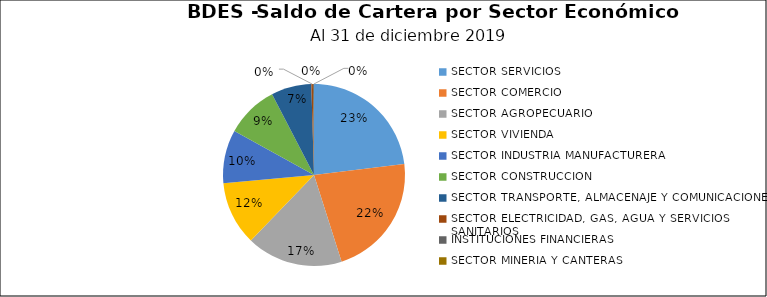
| Category | Saldo | Créditos |
|---|---|---|
| SECTOR SERVICIOS | 92.046 | 3872 |
| SECTOR COMERCIO | 87.842 | 6422 |
| SECTOR AGROPECUARIO | 68.245 | 2240 |
| SECTOR VIVIENDA | 45.237 | 2561 |
| SECTOR INDUSTRIA MANUFACTURERA | 37.903 | 619 |
| SECTOR CONSTRUCCION | 37.237 | 2346 |
| SECTOR TRANSPORTE, ALMACENAJE Y COMUNICACIONES | 28.513 | 1311 |
| SECTOR ELECTRICIDAD, GAS, AGUA Y SERVICIOS SANITARIOS | 1.133 | 10 |
| INSTITUCIONES FINANCIERAS | 0.66 | 3 |
| SECTOR MINERIA Y CANTERAS | 0.096 | 6 |